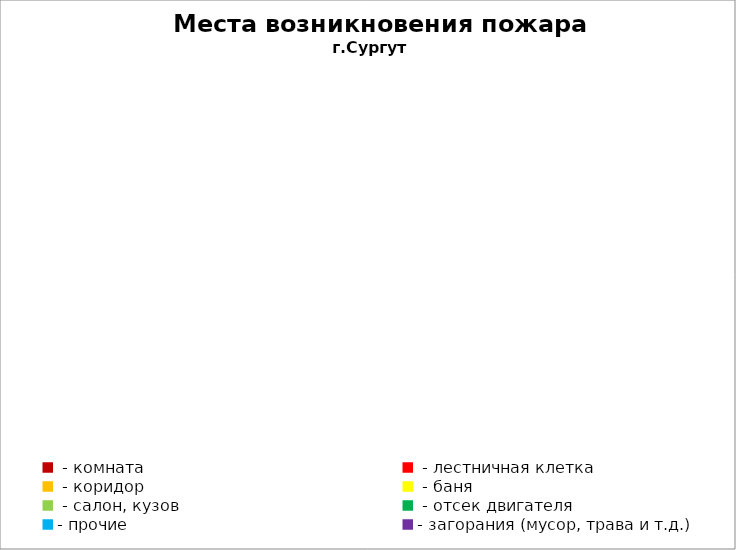
| Category | Места возникновения пожара |
|---|---|
|  - комната | 23 |
|  - лестничная клетка | 3 |
|  - коридор | 5 |
|  - баня | 4 |
|  - салон, кузов | 7 |
|  - отсек двигателя | 27 |
| - прочие | 67 |
| - загорания (мусор, трава и т.д.)  | 37 |